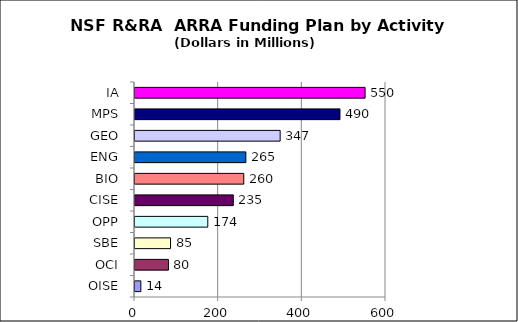
| Category | Series 0 |
|---|---|
| OISE | 14 |
| OCI | 80 |
| SBE | 85 |
| OPP | 174 |
| CISE | 235 |
| BIO | 260 |
| ENG | 265 |
| GEO | 347 |
| MPS | 490 |
| IA | 550 |